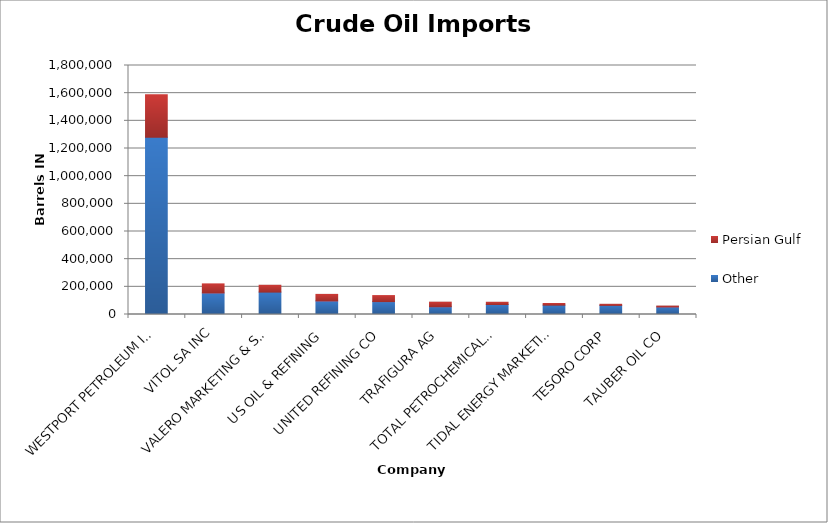
| Category | Other | Persian Gulf |
|---|---|---|
| WESTPORT PETROLEUM INC | 1282023 | 306938 |
| VITOL SA INC | 155717 | 65602 |
| VALERO MARKETING & SUPPLY CO | 161863 | 49433 |
| US OIL & REFINING | 97983 | 47382 |
| UNITED REFINING CO | 93175 | 43563 |
| TRAFIGURA AG | 56099 | 32895 |
| TOTAL PETROCHEMICALS USA INC | 72257 | 16144 |
| TIDAL ENERGY MARKETING INC | 67551 | 12038 |
| TESORO CORP | 65808 | 7901 |
| TAUBER OIL CO | 54512 | 6271 |